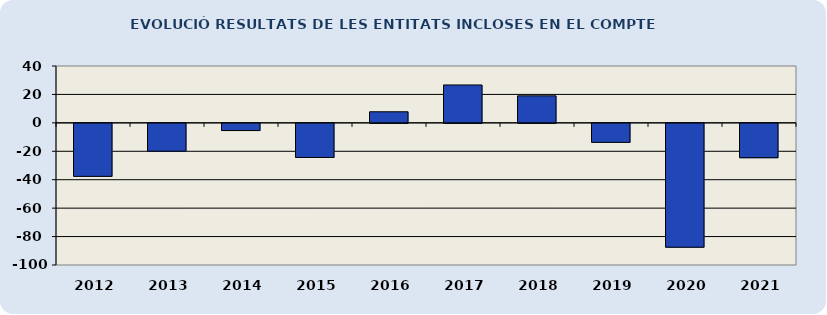
| Category | EVOLUCIÓ RESULTATS DE LES ENTITATS INCLOSES EN EL COMPTE GENERAL  |
|---|---|
| 2012.0 | -37.29 |
| 2013.0 | -19.59 |
| 2014.0 | -5.08 |
| 2015.0 | -24 |
| 2016.0 | 7.8 |
| 2017.0 | 26.66 |
| 2018.0 | 19.02 |
| 2019.0 | -13.37 |
| 2020.0 | -87.13 |
| 2021.0 | -24.16 |